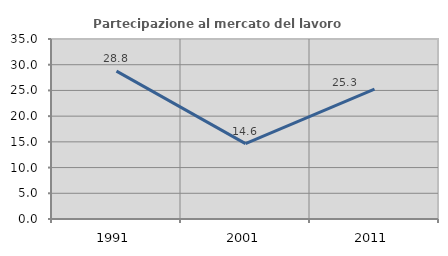
| Category | Partecipazione al mercato del lavoro  femminile |
|---|---|
| 1991.0 | 28.757 |
| 2001.0 | 14.645 |
| 2011.0 | 25.258 |